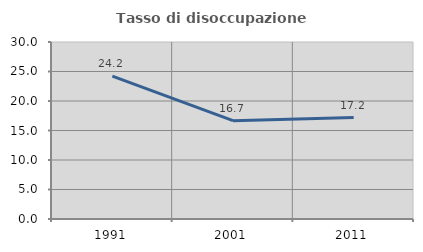
| Category | Tasso di disoccupazione giovanile  |
|---|---|
| 1991.0 | 24.219 |
| 2001.0 | 16.667 |
| 2011.0 | 17.188 |